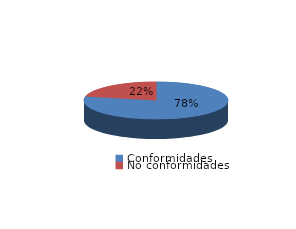
| Category | Series 0 |
|---|---|
| Conformidades | 378 |
| No conformidades | 104 |